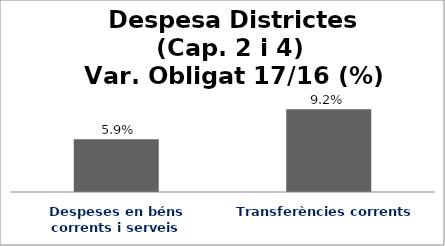
| Category | Series 0 |
|---|---|
| Despeses en béns corrents i serveis | 0.059 |
| Transferències corrents | 0.092 |